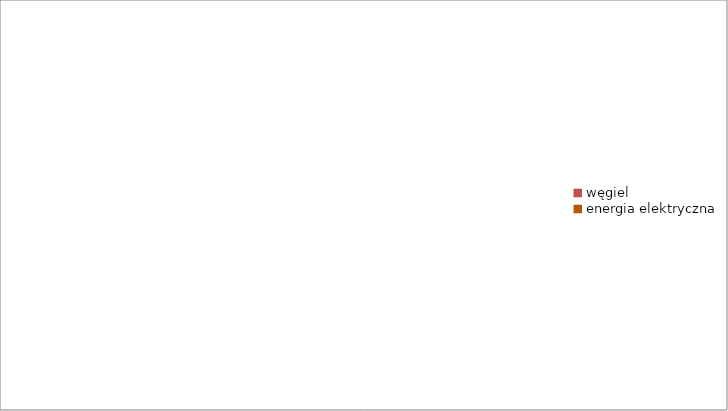
| Category | Series 0 |
|---|---|
| węgiel | 0 |
| energia elektryczna | 0 |